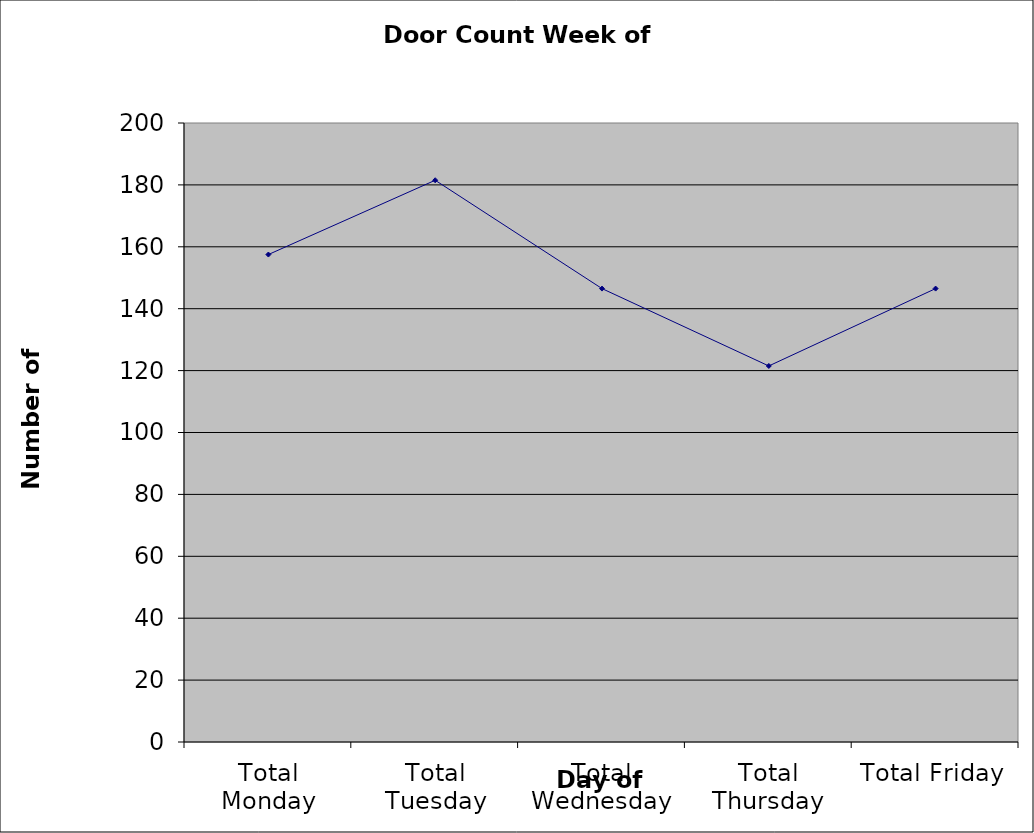
| Category | Series 0 |
|---|---|
| Total Monday | 157.5 |
| Total Tuesday | 181.5 |
| Total Wednesday | 146.5 |
| Total Thursday | 121.5 |
| Total Friday | 146.5 |